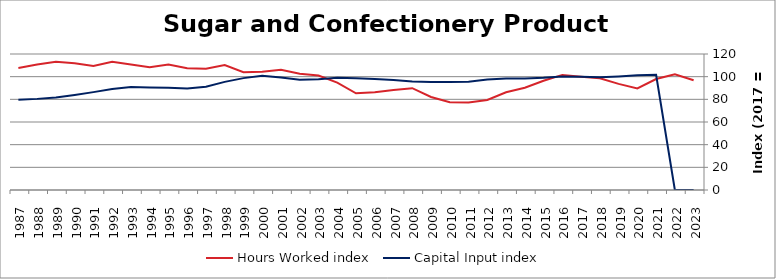
| Category | Hours Worked index | Capital Input index |
|---|---|---|
| 2023.0 | 96.847 | 0 |
| 2022.0 | 102.152 | 0 |
| 2021.0 | 97.891 | 101.688 |
| 2020.0 | 89.596 | 101.143 |
| 2019.0 | 93.632 | 100.248 |
| 2018.0 | 98.532 | 99.532 |
| 2017.0 | 100 | 100 |
| 2016.0 | 101.544 | 100.074 |
| 2015.0 | 96.413 | 99.036 |
| 2014.0 | 90.25 | 98.467 |
| 2013.0 | 86.237 | 98.46 |
| 2012.0 | 79.434 | 97.541 |
| 2011.0 | 77.303 | 95.421 |
| 2010.0 | 77.372 | 95.299 |
| 2009.0 | 82.092 | 95.362 |
| 2008.0 | 89.811 | 95.682 |
| 2007.0 | 88.273 | 97.163 |
| 2006.0 | 86.273 | 97.852 |
| 2005.0 | 85.274 | 98.58 |
| 2004.0 | 94.717 | 99.006 |
| 2003.0 | 100.99 | 97.745 |
| 2002.0 | 102.582 | 97.195 |
| 2001.0 | 106.181 | 99.278 |
| 2000.0 | 104.413 | 100.775 |
| 1999.0 | 103.886 | 98.719 |
| 1998.0 | 110.245 | 95.417 |
| 1997.0 | 107.058 | 91.182 |
| 1996.0 | 107.516 | 89.504 |
| 1995.0 | 110.733 | 90.277 |
| 1994.0 | 108.393 | 90.529 |
| 1993.0 | 110.819 | 90.866 |
| 1992.0 | 113.22 | 89.06 |
| 1991.0 | 109.39 | 86.358 |
| 1990.0 | 111.858 | 83.897 |
| 1989.0 | 113.101 | 81.689 |
| 1988.0 | 110.681 | 80.404 |
| 1987.0 | 107.612 | 79.573 |